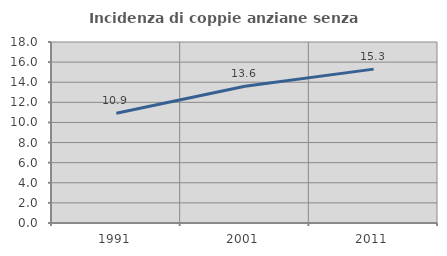
| Category | Incidenza di coppie anziane senza figli  |
|---|---|
| 1991.0 | 10.923 |
| 2001.0 | 13.606 |
| 2011.0 | 15.302 |